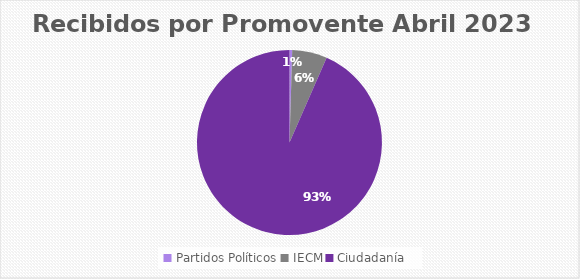
| Category | Recibidos por Promovente ABRIL |
|---|---|
| Partidos Políticos | 1 |
| IECM | 13 |
| Ciudadanía  | 199 |